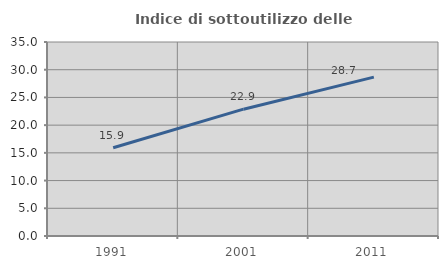
| Category | Indice di sottoutilizzo delle abitazioni  |
|---|---|
| 1991.0 | 15.924 |
| 2001.0 | 22.881 |
| 2011.0 | 28.664 |